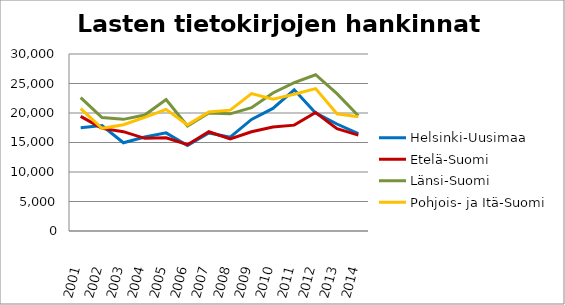
| Category | Helsinki-Uusimaa | Etelä-Suomi | Länsi-Suomi | Pohjois- ja Itä-Suomi |
|---|---|---|---|---|
| 2001.0 | 17485 | 19430 | 22620 | 20749 |
| 2002.0 | 17872 | 17385 | 19223 | 17401 |
| 2003.0 | 14953 | 16837 | 18924 | 18008 |
| 2004.0 | 15927 | 15707 | 19652 | 19262 |
| 2005.0 | 16631 | 15802 | 22292 | 20611 |
| 2006.0 | 14472 | 14626 | 17803 | 17985 |
| 2007.0 | 16625 | 16828 | 20010 | 20160 |
| 2008.0 | 15897 | 15589 | 19855 | 20487 |
| 2009.0 | 18904 | 16811 | 20906 | 23276 |
| 2010.0 | 20773 | 17626 | 23387 | 22325 |
| 2011.0 | 23925 | 17940 | 25135 | 23169 |
| 2012.0 | 20012 | 20076 | 26485 | 24133 |
| 2013.0 | 18132 | 17357 | 23278 | 19869 |
| 2014.0 | 16510 | 16253 | 19536 | 19349 |